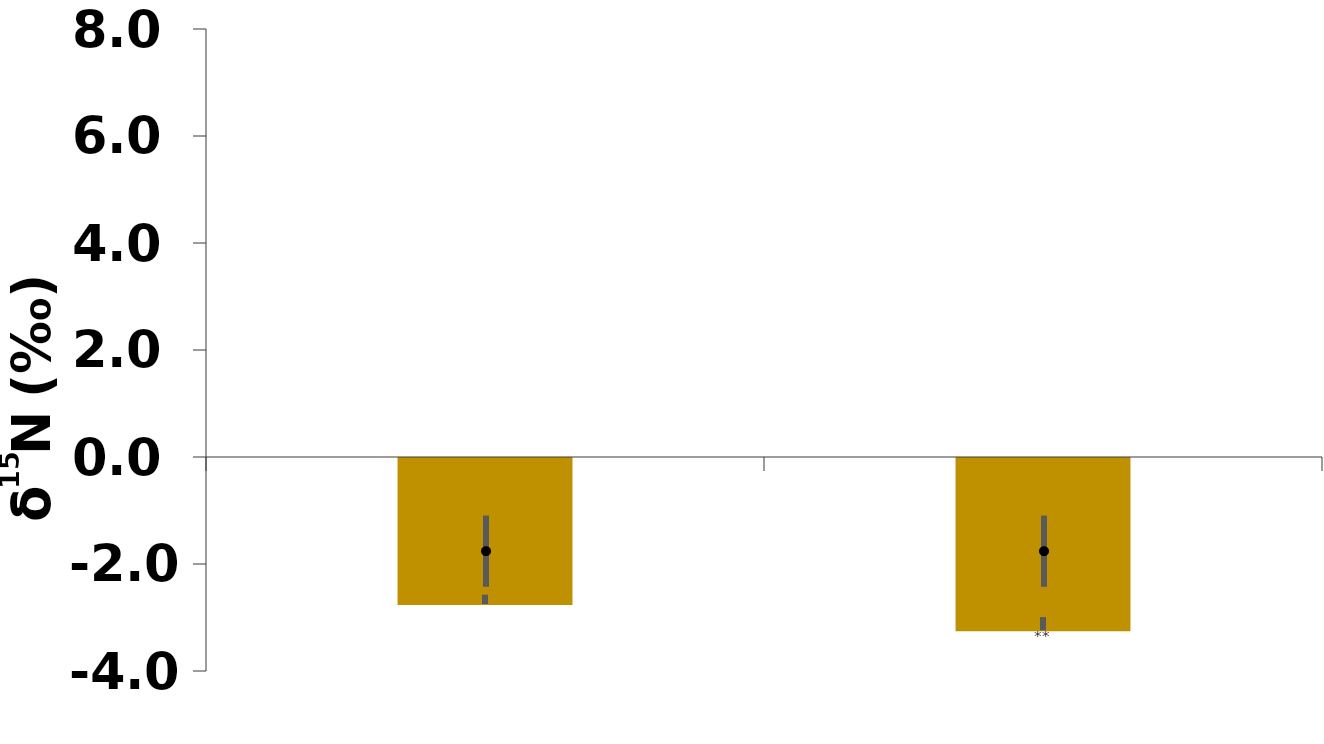
| Category | Whole plant |
|---|---|
| 0.0 | -2.748 |
| 0.0 | -3.238 |